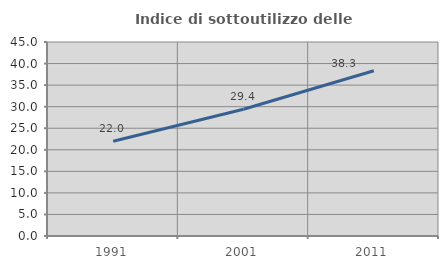
| Category | Indice di sottoutilizzo delle abitazioni  |
|---|---|
| 1991.0 | 21.991 |
| 2001.0 | 29.391 |
| 2011.0 | 38.329 |